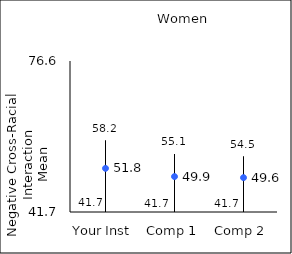
| Category | 25th percentile | 75th percentile | Mean |
|---|---|---|---|
| Your Inst | 41.7 | 58.2 | 51.79 |
| Comp 1 | 41.7 | 55.1 | 49.89 |
| Comp 2 | 41.7 | 54.5 | 49.64 |